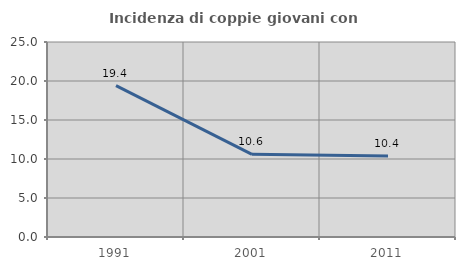
| Category | Incidenza di coppie giovani con figli |
|---|---|
| 1991.0 | 19.41 |
| 2001.0 | 10.602 |
| 2011.0 | 10.384 |